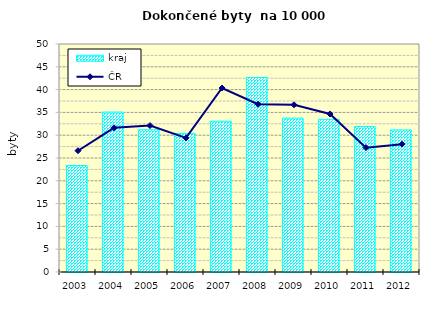
| Category | kraj |
|---|---|
| 2003.0 | 23.362 |
| 2004.0 | 35.064 |
| 2005.0 | 31.208 |
| 2006.0 | 30.358 |
| 2007.0 | 33.07 |
| 2008.0 | 42.656 |
| 2009.0 | 33.735 |
| 2010.0 | 33.5 |
| 2011.0 | 31.891 |
| 2012.0 | 31.161 |